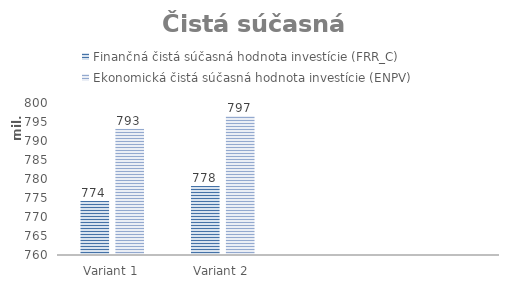
| Category | Finančná čistá súčasná hodnota investície (FRR_C) | Ekonomická čistá súčasná hodnota investície (ENPV) |
|---|---|---|
| Variant 1 | 774223058.381 | 793244988.289 |
| Variant 2 | 778158721.417 | 796584381.285 |